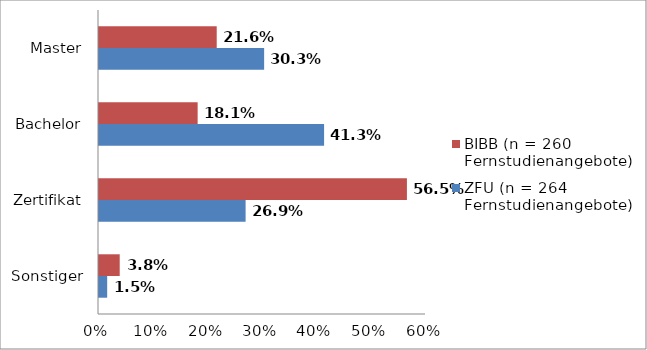
| Category | ZFU (n = 264 Fernstudienangebote) | BIBB (n = 260 Fernstudienangebote) |
|---|---|---|
| Sonstiger | 0.015 | 0.038 |
| Zertifikat | 0.269 | 0.565 |
| Bachelor | 0.413 | 0.181 |
| Master | 0.303 | 0.216 |